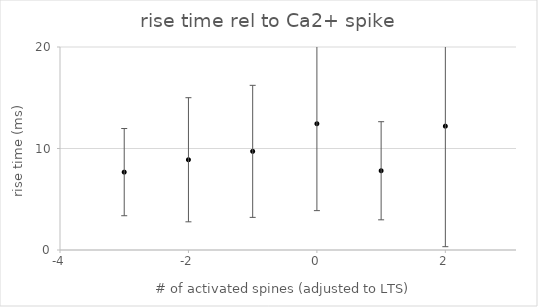
| Category | Series 0 |
|---|---|
| -3.0 | 7.672 |
| -2.0 | 8.891 |
| -1.0 | 9.719 |
| 0.0 | 12.44 |
| 1.0 | 7.808 |
| 2.0 | 12.2 |